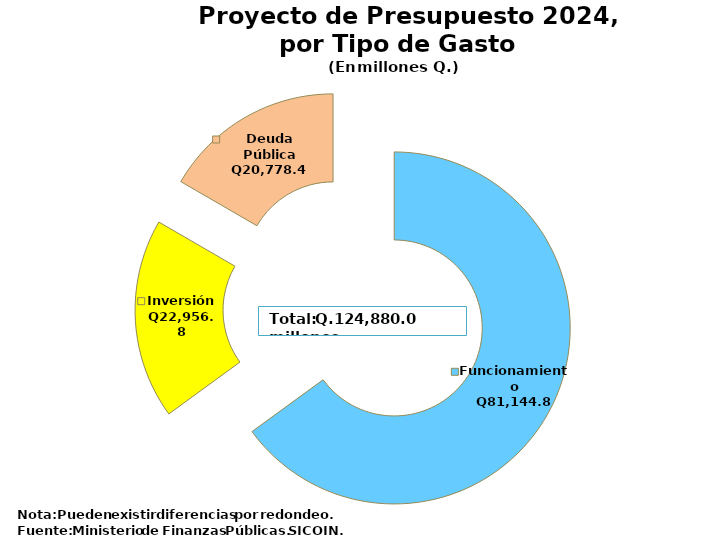
| Category | Recomendado 2022 |
|---|---|
| Funcionamiento | 81144.8 |
| Inversión | 22956.8 |
| Deuda Pública | 20778.4 |